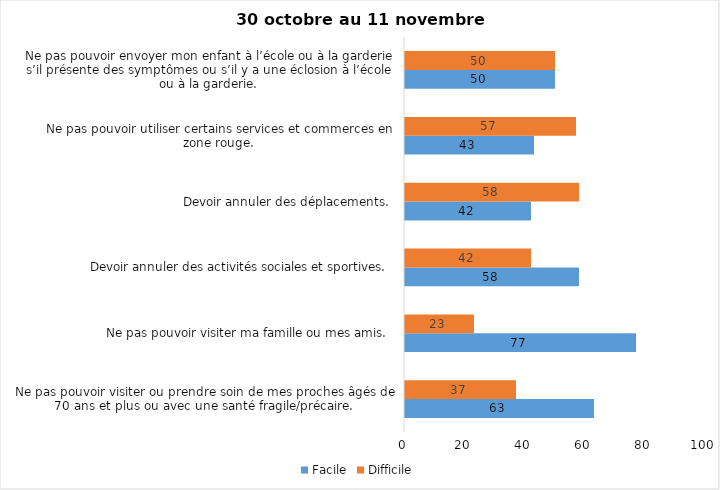
| Category | Facile | Difficile |
|---|---|---|
| Ne pas pouvoir visiter ou prendre soin de mes proches âgés de 70 ans et plus ou avec une santé fragile/précaire.  | 63 | 37 |
| Ne pas pouvoir visiter ma famille ou mes amis.  | 77 | 23 |
| Devoir annuler des activités sociales et sportives.  | 58 | 42 |
| Devoir annuler des déplacements.  | 42 | 58 |
| Ne pas pouvoir utiliser certains services et commerces en zone rouge.  | 43 | 57 |
| Ne pas pouvoir envoyer mon enfant à l’école ou à la garderie s’il présente des symptômes ou s’il y a une éclosion à l’école ou à la garderie.  | 50 | 50 |